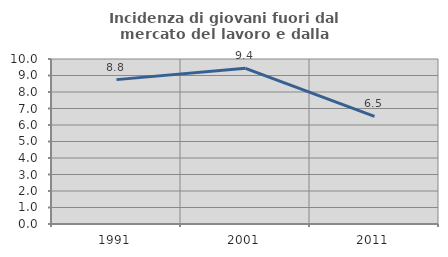
| Category | Incidenza di giovani fuori dal mercato del lavoro e dalla formazione  |
|---|---|
| 1991.0 | 8.75 |
| 2001.0 | 9.434 |
| 2011.0 | 6.522 |